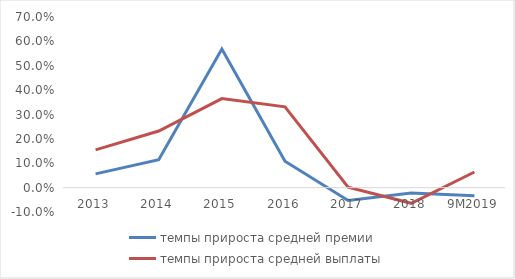
| Category | темпы прироста средней премии | темпы прироста средней выплаты |
|---|---|---|
| 2013 | 0.056 | 0.155 |
| 2014 | 0.114 | 0.232 |
| 2015 | 0.569 | 0.365 |
| 2016 | 0.108 | 0.331 |
| 2017 | -0.053 | 0.002 |
| 2018 | -0.022 | -0.064 |
| 9М2019 | -0.034 | 0.064 |